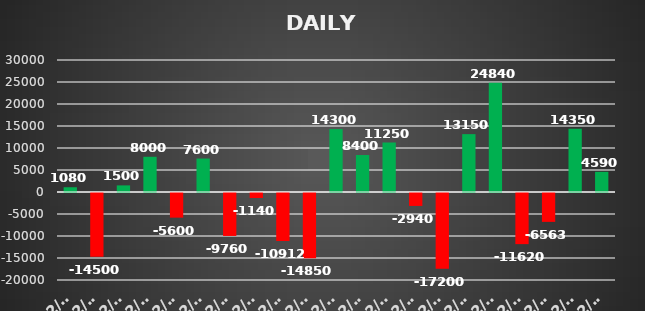
| Category | Series 0 |
|---|---|
| 2023-02-03 | 1080 |
| 2023-02-03 | -14500 |
| 2023-02-06 | 1500 |
| 2023-02-07 | 8000 |
| 2023-02-08 | -5600 |
| 2023-02-08 | 7600 |
| 2023-02-09 | -9760 |
| 2023-02-10 | -1140 |
| 2023-02-10 | -10912.5 |
| 2023-02-13 | -14850 |
| 2023-02-14 | 14300 |
| 2023-02-15 | 8400 |
| 2023-02-16 | 11250 |
| 2023-02-17 | -2940 |
| 2023-02-17 | -17200 |
| 2023-02-20 | 13150 |
| 2023-02-21 | 24840 |
| 2023-02-22 | -11620 |
| 2023-02-23 | -6562.5 |
| 2023-02-24 | 14350 |
| 2023-02-27 | 4590 |